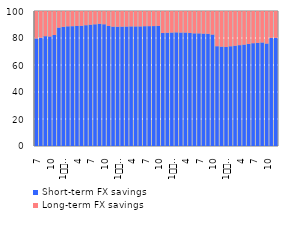
| Category | Short-term FX savings | Long-term FX savings |
|---|---|---|
| 7 | 79.672 | 20.328 |
| 8 | 80.226 | 19.774 |
| 9 | 81.351 | 18.649 |
| 10 | 81.133 | 18.867 |
| 11 | 82.237 | 17.763 |
| 12 | 87.688 | 12.312 |
| 1
2009 | 88.25 | 11.75 |
| 2 | 88.657 | 11.343 |
| 3 | 88.75 | 11.25 |
| 4 | 88.905 | 11.095 |
| 5 | 89.056 | 10.944 |
| 6 | 89.474 | 10.526 |
| 7 | 89.851 | 10.149 |
| 8 | 90.154 | 9.846 |
| 9 | 90.479 | 9.521 |
| 10 | 90.184 | 9.816 |
| 11 | 88.904 | 11.096 |
| 12 | 88.415 | 11.585 |
| 1
2010 | 88.393 | 11.607 |
| 2 | 88.418 | 11.582 |
| 3 | 88.494 | 11.506 |
| 4 | 88.597 | 11.403 |
| 5 | 88.578 | 11.422 |
| 6 | 88.59 | 11.41 |
| 7 | 88.749 | 11.251 |
| 8 | 88.784 | 11.216 |
| 9 | 88.831 | 11.169 |
| 10 | 88.984 | 11.016 |
| 11 | 83.713 | 16.287 |
| 12 | 83.915 | 16.085 |
| 1
2011 | 84.057 | 15.943 |
| 2 | 84.188 | 15.812 |
| 3 | 84.041 | 15.959 |
| 4 | 84.036 | 15.964 |
| 5 | 83.694 | 16.306 |
| 6 | 83.457 | 16.543 |
| 7 | 83.437 | 16.563 |
| 8 | 83.254 | 16.746 |
| 9 | 83.127 | 16.873 |
| 10 | 82.566 | 17.434 |
| 11 | 73.914 | 26.086 |
| 12 | 73.596 | 26.404 |
| 1
2012 | 73.361 | 26.639 |
| 2 | 73.876 | 26.124 |
| 3 | 74.282 | 25.718 |
| 4 | 74.705 | 25.295 |
| 5 | 75.102 | 24.898 |
| 6 | 75.595 | 24.405 |
| 7 | 76.154 | 23.846 |
| 8 | 76.355 | 23.645 |
| 9 | 76.684 | 23.316 |
| 10 | 75.887 | 24.113 |
| 11 | 80.09 | 19.91 |
| 12 | 80.09 | 19.91 |